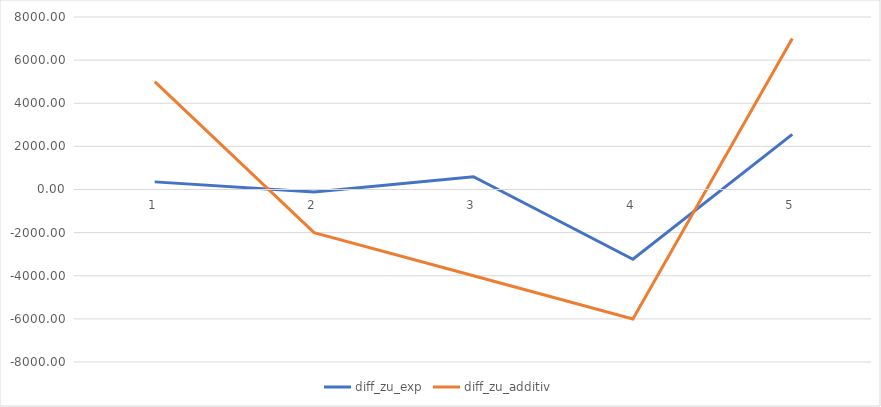
| Category | diff_zu_exp | diff_zu_additiv |
|---|---|---|
| 0 | 353.504 | 5000 |
| 1 | -116.889 | -2000 |
| 2 | 591.009 | -4000 |
| 3 | -3236.294 | -6000 |
| 4 | 2554.506 | 7000 |